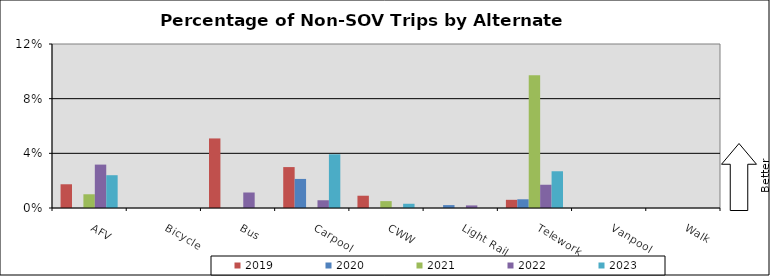
| Category | 2019 | 2020 | 2021 | 2022 | 2023 |
|---|---|---|---|---|---|
| AFV | 0.017 | 0 | 0.01 | 0.032 | 0.024 |
| Bicycle | 0 | 0 | 0 | 0 | 0 |
| Bus | 0.051 | 0 | 0 | 0.011 | 0 |
| Carpool | 0.03 | 0.021 | 0 | 0.006 | 0.039 |
| CWW | 0.009 | 0 | 0.005 | 0 | 0.003 |
| Light Rail | 0 | 0.002 | 0 | 0.002 | 0 |
| Telework | 0.006 | 0.006 | 0.097 | 0.017 | 0.027 |
| Vanpool | 0 | 0 | 0 | 0 | 0 |
| Walk | 0 | 0 | 0 | 0 | 0 |